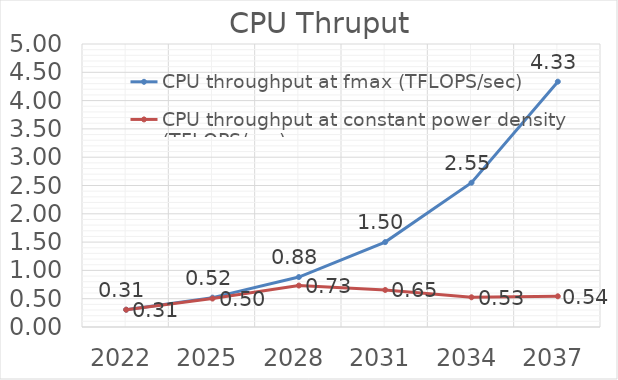
| Category | CPU throughput at fmax (TFLOPS/sec) | CPU throughput at constant power density (TFLOPS/sec) |
|---|---|---|
| 2022.0 | 0.305 | 0.305 |
| 2025.0 | 0.519 | 0.502 |
| 2028.0 | 0.882 | 0.732 |
| 2031.0 | 1.5 | 0.654 |
| 2034.0 | 2.55 | 0.525 |
| 2037.0 | 4.335 | 0.543 |